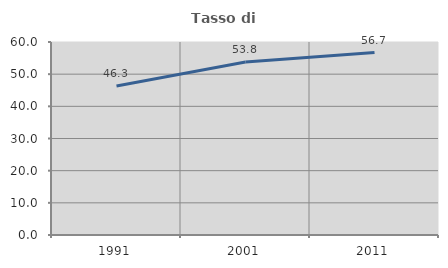
| Category | Tasso di occupazione   |
|---|---|
| 1991.0 | 46.311 |
| 2001.0 | 53.768 |
| 2011.0 | 56.719 |